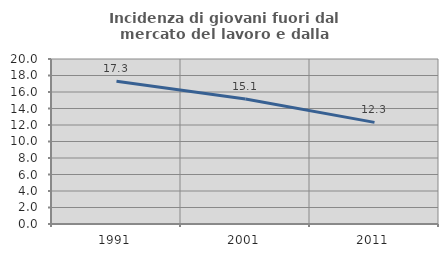
| Category | Incidenza di giovani fuori dal mercato del lavoro e dalla formazione  |
|---|---|
| 1991.0 | 17.295 |
| 2001.0 | 15.147 |
| 2011.0 | 12.319 |